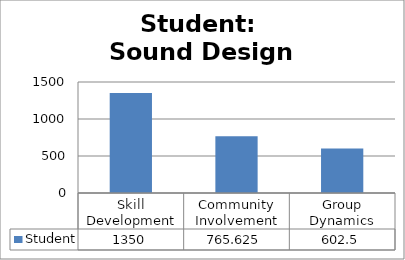
| Category | Student |
|---|---|
| Skill Development | 1350 |
| Community Involvement | 765.625 |
| Group Dynamics | 602.5 |